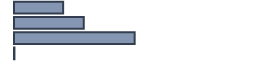
| Category | Percentatge |
|---|---|
| 0 | 20.475 |
| 1 | 29.068 |
| 2 | 50.274 |
| 3 | 0.183 |